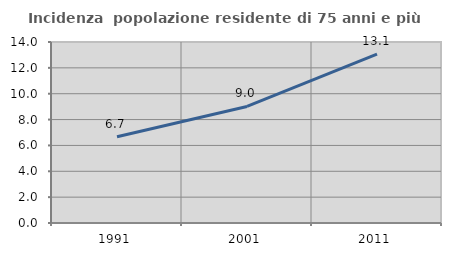
| Category | Incidenza  popolazione residente di 75 anni e più |
|---|---|
| 1991.0 | 6.673 |
| 2001.0 | 9.017 |
| 2011.0 | 13.063 |